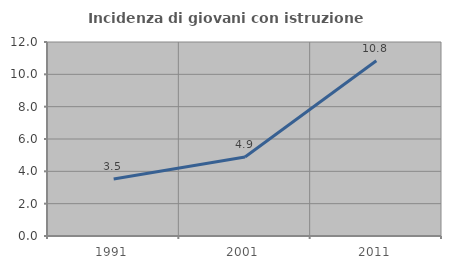
| Category | Incidenza di giovani con istruzione universitaria |
|---|---|
| 1991.0 | 3.521 |
| 2001.0 | 4.882 |
| 2011.0 | 10.843 |